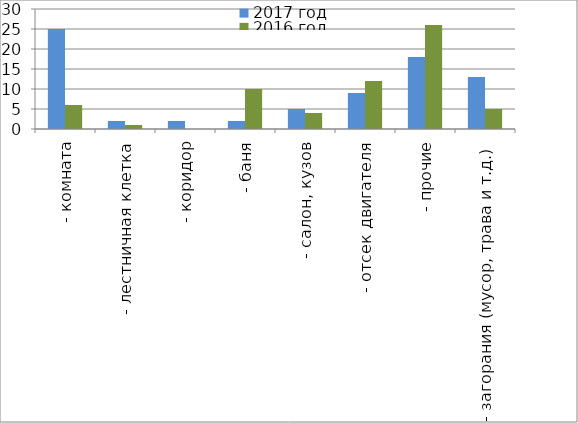
| Category | 2017 год | 2016 год |
|---|---|---|
|  - комната | 25 | 6 |
|  - лестничная клетка | 2 | 1 |
|  - коридор | 2 | 0 |
|  - баня | 2 | 10 |
|  - салон, кузов | 5 | 4 |
|  - отсек двигателя | 9 | 12 |
| - прочие | 18 | 26 |
| - загорания (мусор, трава и т.д.)  | 13 | 5 |